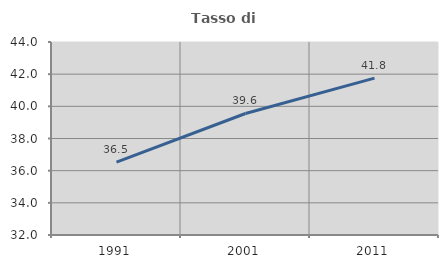
| Category | Tasso di occupazione   |
|---|---|
| 1991.0 | 36.529 |
| 2001.0 | 39.556 |
| 2011.0 | 41.754 |